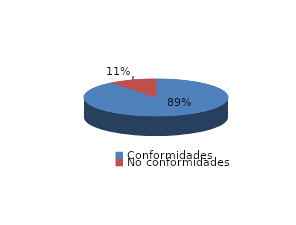
| Category | Series 0 |
|---|---|
| Conformidades | 774 |
| No conformidades | 93 |